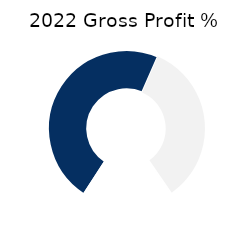
| Category | Top |
|---|---|
| 0 | 75.801 |
| 1 | 54.199 |
| 2 | 30 |